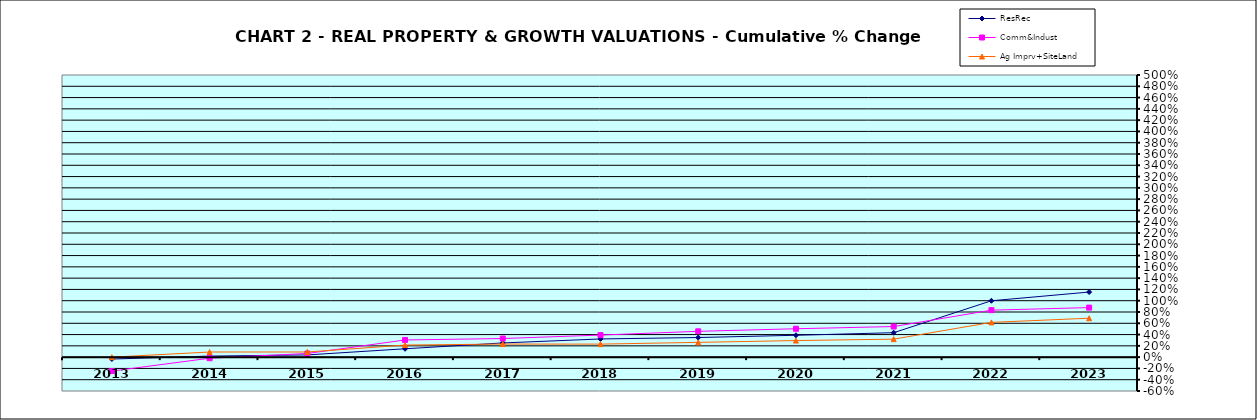
| Category | ResRec | Comm&Indust | Ag Imprv+SiteLand |
|---|---|---|---|
| 2013.0 | -0.034 | -0.247 | 0 |
| 2014.0 | 0.019 | -0.019 | 0.091 |
| 2015.0 | 0.04 | 0.065 | 0.091 |
| 2016.0 | 0.148 | 0.304 | 0.214 |
| 2017.0 | 0.252 | 0.33 | 0.232 |
| 2018.0 | 0.322 | 0.391 | 0.231 |
| 2019.0 | 0.348 | 0.458 | 0.262 |
| 2020.0 | 0.387 | 0.503 | 0.294 |
| 2021.0 | 0.433 | 0.542 | 0.319 |
| 2022.0 | 0.999 | 0.832 | 0.616 |
| 2023.0 | 1.153 | 0.878 | 0.69 |